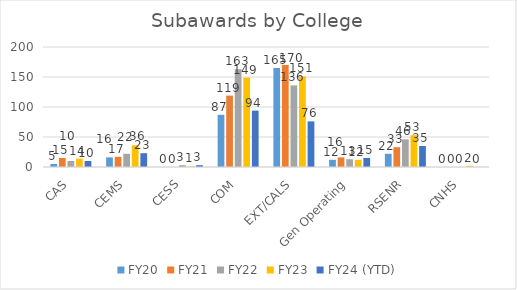
| Category | FY20 | FY21 | FY22 | FY23 | FY24 (YTD) |
|---|---|---|---|---|---|
| CAS | 5 | 15 | 10 | 14 | 10 |
| CEMS | 16 | 17 | 22 | 36 | 23 |
| CESS | 0 | 0 | 3 | 1 | 3 |
| COM | 87 | 119 | 163 | 149 | 94 |
| EXT/CALS | 165 | 170 | 136 | 151 | 76 |
| Gen Operating | 12 | 16 | 13 | 12 | 15 |
| RSENR | 22 | 33 | 46 | 53 | 35 |
| CNHS | 0 | 0 | 0 | 2 | 0 |